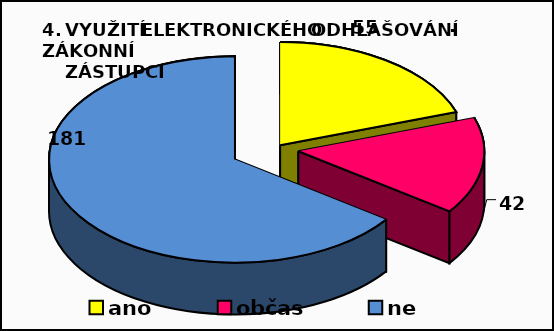
| Category | Series 0 |
|---|---|
| ano | 55 |
| občas | 42 |
| ne | 181 |